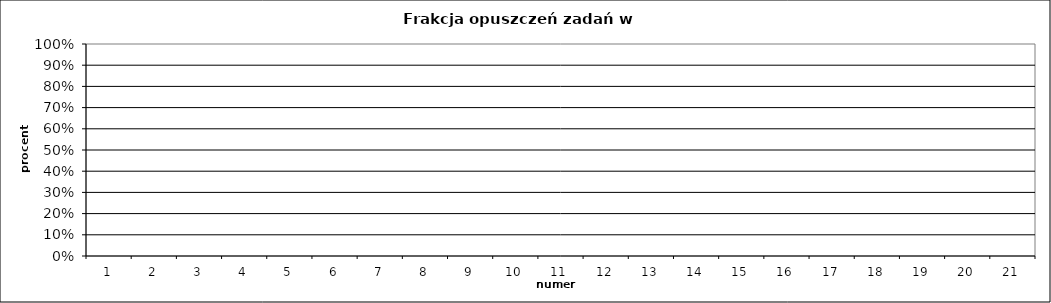
| Category | fo |
|---|---|
| 1.0 | 0 |
| 2.0 | 0 |
| 3.0 | 0 |
| 4.0 | 0 |
| 5.0 | 0 |
| 6.0 | 0 |
| 7.0 | 0 |
| 8.0 | 0 |
| 9.0 | 0 |
| 10.0 | 0 |
| 11.0 | 0 |
| 12.0 | 0 |
| 13.0 | 0 |
| 14.0 | 0 |
| 15.0 | 0 |
| 16.0 | 0 |
| 17.0 | 0 |
| 18.0 | 0 |
| 19.0 | 0 |
| 20.0 | 0 |
| 21.0 | 0 |